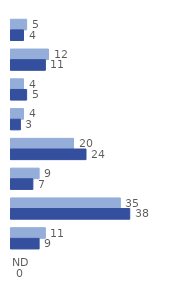
| Category | 2008-2012 | 2013-2018 |
|---|---|---|
| 0 | 5 | 4 |
| 1 | 12 | 11 |
| 2 | 4 | 5 |
| 3 | 4 | 3 |
| 4 | 20 | 24 |
| 5 | 9 | 7 |
| 6 | 35 | 38 |
| 7 | 11 | 9 |
| 8 | 0 | 0 |